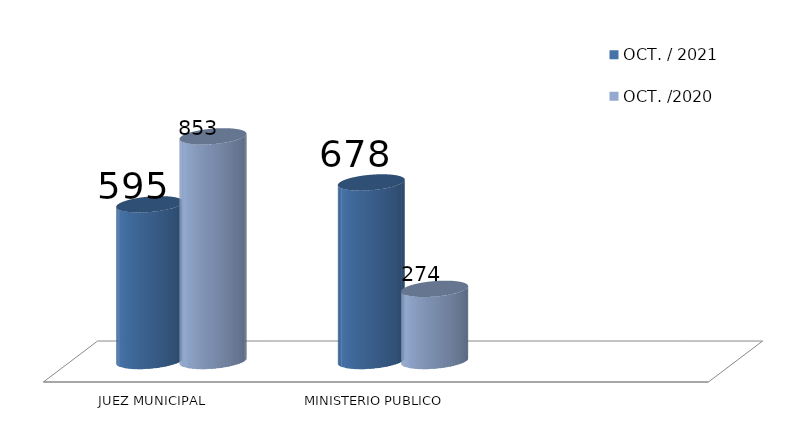
| Category | OCT. / 2021 | OCT. /2020 |
|---|---|---|
| JUEZ MUNICIPAL | 595 | 853 |
| MINISTERIO PUBLICO | 678 | 274 |